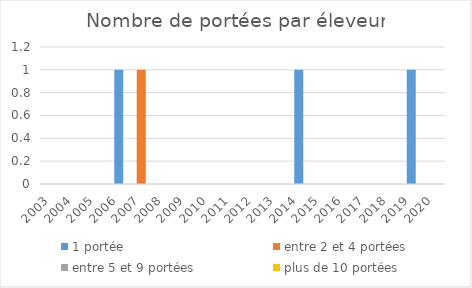
| Category | 1 portée | entre 2 et 4 portées | entre 5 et 9 portées | plus de 10 portées |
|---|---|---|---|---|
| 2003.0 | 0 | 0 | 0 | 0 |
| 2004.0 | 0 | 0 | 0 | 0 |
| 2005.0 | 0 | 0 | 0 | 0 |
| 2006.0 | 1 | 0 | 0 | 0 |
| 2007.0 | 0 | 1 | 0 | 0 |
| 2008.0 | 0 | 0 | 0 | 0 |
| 2009.0 | 0 | 0 | 0 | 0 |
| 2010.0 | 0 | 0 | 0 | 0 |
| 2011.0 | 0 | 0 | 0 | 0 |
| 2012.0 | 0 | 0 | 0 | 0 |
| 2013.0 | 0 | 0 | 0 | 0 |
| 2014.0 | 1 | 0 | 0 | 0 |
| 2015.0 | 0 | 0 | 0 | 0 |
| 2016.0 | 0 | 0 | 0 | 0 |
| 2017.0 | 0 | 0 | 0 | 0 |
| 2018.0 | 0 | 0 | 0 | 0 |
| 2019.0 | 1 | 0 | 0 | 0 |
| 2020.0 | 0 | 0 | 0 | 0 |